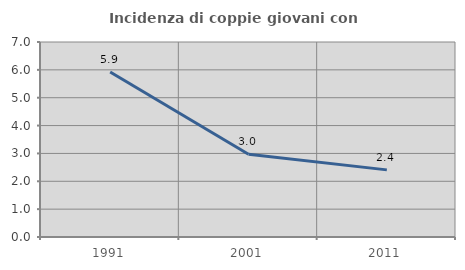
| Category | Incidenza di coppie giovani con figli |
|---|---|
| 1991.0 | 5.921 |
| 2001.0 | 2.97 |
| 2011.0 | 2.41 |